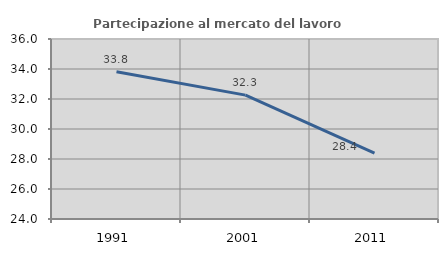
| Category | Partecipazione al mercato del lavoro  femminile |
|---|---|
| 1991.0 | 33.815 |
| 2001.0 | 32.258 |
| 2011.0 | 28.395 |